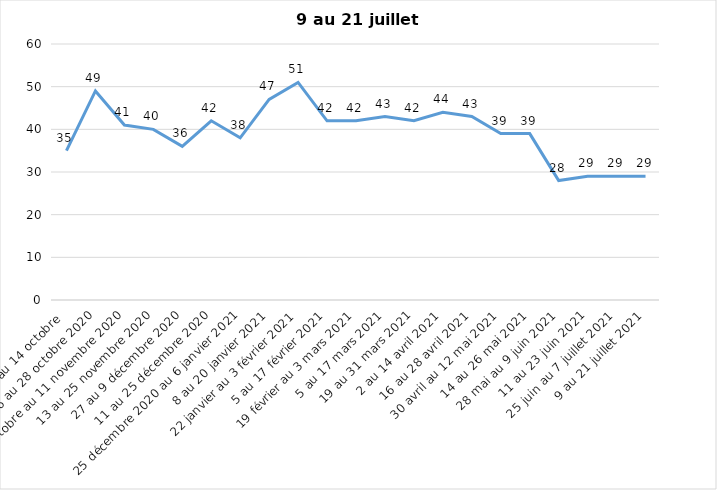
| Category | Toujours aux trois mesures |
|---|---|
| 2 au 14 octobre  | 35 |
| 16 au 28 octobre 2020 | 49 |
| 30 octobre au 11 novembre 2020 | 41 |
| 13 au 25 novembre 2020 | 40 |
| 27 au 9 décembre 2020 | 36 |
| 11 au 25 décembre 2020 | 42 |
| 25 décembre 2020 au 6 janvier 2021 | 38 |
| 8 au 20 janvier 2021 | 47 |
| 22 janvier au 3 février 2021 | 51 |
| 5 au 17 février 2021 | 42 |
| 19 février au 3 mars 2021 | 42 |
| 5 au 17 mars 2021 | 43 |
| 19 au 31 mars 2021 | 42 |
| 2 au 14 avril 2021 | 44 |
| 16 au 28 avril 2021 | 43 |
| 30 avril au 12 mai 2021 | 39 |
| 14 au 26 mai 2021 | 39 |
| 28 mai au 9 juin 2021 | 28 |
| 11 au 23 juin 2021 | 29 |
| 25 juin au 7 juillet 2021 | 29 |
| 9 au 21 juillet 2021 | 29 |